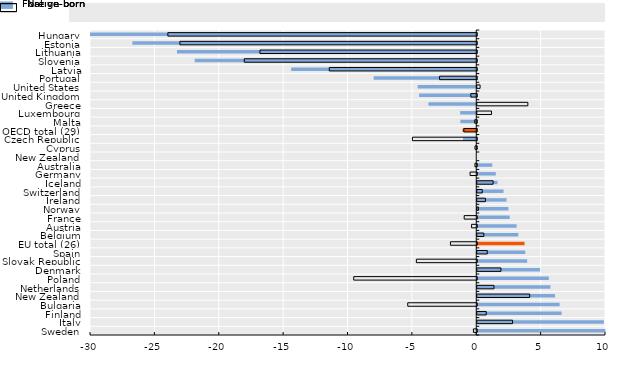
| Category | Foreign-born | Native-born |
|---|---|---|
| Sweden | 9.955 | -0.258 |
| Italy | 9.832 | 2.743 |
| Finland | 6.551 | 0.699 |
| Bulgaria | 6.398 | -5.36 |
| New Zealand | 6.041 | 4.071 |
| Netherlands | 5.682 | 1.297 |
| Poland | 5.559 | -9.555 |
| Denmark | 4.885 | 1.838 |
| Slovak Republic | 3.875 | -4.689 |
| Spain | 3.729 | 0.777 |
| EU total (26) | 3.672 | -2.044 |
| Belgium | 3.189 | 0.511 |
| Austria | 3.056 | -0.403 |
| France | 2.524 | -0.977 |
| Norway | 2.421 | 0.089 |
| Ireland | 2.273 | 0.636 |
| Switzerland | 2.04 | 0.39 |
| Iceland | 1.565 | 1.229 |
| Germany | 1.438 | -0.517 |
| Australia | 1.164 | -0.142 |
| New Zealand | 0 | 0 |
| Cyprus | -0.019 | -0.135 |
| Czech Republic | -1.03 | -4.996 |
| OECD total (29) | -1.062 | -1.004 |
| Malta | -1.235 | -0.156 |
| Luxembourg | -1.249 | 1.107 |
| Greece | -3.717 | 3.931 |
| United Kingdom | -4.445 | -0.462 |
| United States | -4.55 | 0.22 |
| Portugal | -7.969 | -2.888 |
| Latvia | -14.376 | -11.453 |
| Slovenia | -21.865 | -18.056 |
| Lithuania | -23.242 | -16.84 |
| Estonia | -26.714 | -23.058 |
| Hungary | -31.129 | -23.992 |